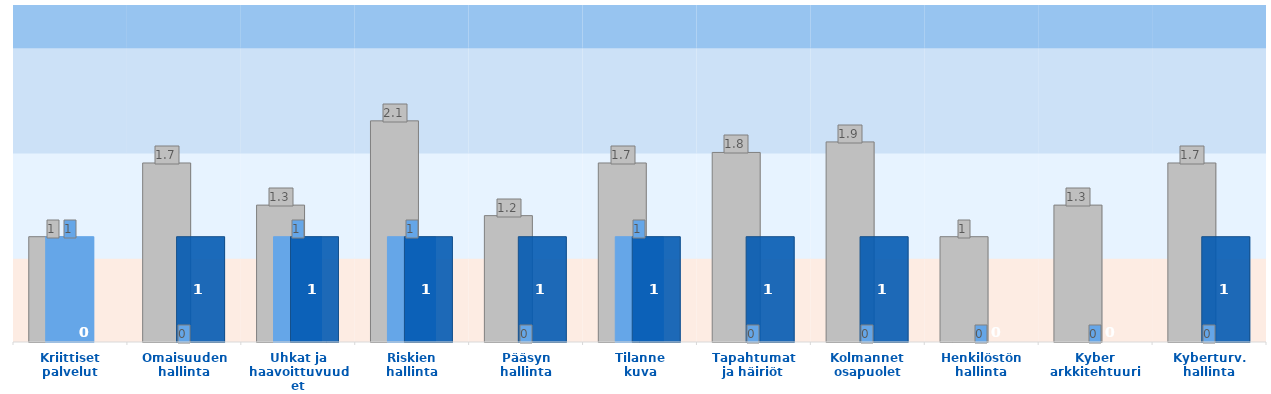
| Category | MIL0 | MIL1 | MIl2 | MIL3 |
|---|---|---|---|---|
| Kriittiset
palvelut | 0.8 | 1 | 1 | 0.5 |
| Omaisuuden
hallinta | 0.8 | 1 | 1 | 0.5 |
| Uhkat ja
haavoittuvuudet | 0.8 | 1 | 1 | 0.5 |
| Riskien
hallinta | 0.8 | 1 | 1 | 0.5 |
| Pääsyn
hallinta | 0.8 | 1 | 1 | 0.5 |
| Tilanne
kuva | 0.8 | 1 | 1 | 0.5 |
| Tapahtumat
ja häiriöt | 0.8 | 1 | 1 | 0.5 |
| Kolmannet
osapuolet | 0.8 | 1 | 1 | 0.5 |
| Henkilöstön
hallinta | 0.8 | 1 | 1 | 0.5 |
| Kyber
arkkitehtuuri | 0.8 | 1 | 1 | 0.5 |
| Kyberturv.
hallinta | 0.8 | 1 | 1 | 0.5 |